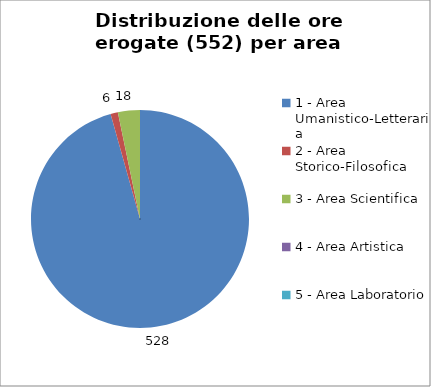
| Category | Nr. Ore Erogate |
|---|---|
| 1 - Area Umanistico-Letteraria | 528 |
| 2 - Area Storico-Filosofica | 6 |
| 3 - Area Scientifica | 18 |
| 4 - Area Artistica | 0 |
| 5 - Area Laboratorio | 0 |